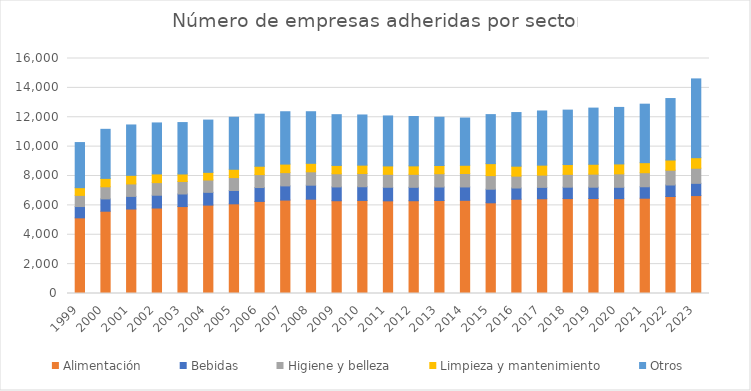
| Category | Alimentación | Bebidas | Higiene y belleza | Limpieza y mantenimiento | Otros |
|---|---|---|---|---|---|
| 1999.0 | 5150.832 | 769.747 | 760.498 | 524.127 | 3071.795 |
| 2000.0 | 5602.414 | 837.232 | 827.172 | 570.078 | 3341.104 |
| 2001.0 | 5751.27 | 859.478 | 849.15 | 585.225 | 3429.878 |
| 2002.0 | 5820.436 | 869.814 | 859.362 | 592.263 | 3471.126 |
| 2003.0 | 5919.087 | 855.393 | 850 | 513 | 3500.71 |
| 2004.0 | 6017.755 | 869.652 | 840.072 | 520.608 | 3559.066 |
| 2005.0 | 6105.6 | 908.4 | 879.6 | 564 | 3542.4 |
| 2006.0 | 6269 | 945 | 881 | 570 | 3543 |
| 2007.0 | 6360.75 | 965.25 | 903.375 | 581.625 | 3564 |
| 2008.0 | 6420.669 | 954.19 | 910.874 | 577.959 | 3512.309 |
| 2009.0 | 6316.39 | 938.692 | 896.08 | 568.572 | 3455.265 |
| 2010.0 | 6336.402 | 931.073 | 899.47 | 572.5 | 3415.555 |
| 2011.0 | 6309 | 923.523 | 882.424 | 571.762 | 3401.563 |
| 2012.0 | 6317 | 913.466 | 883.338 | 577.243 | 3359.819 |
| 2013.0 | 6333.6 | 915.6 | 906 | 559.2 | 3285.6 |
| 2014.0 | 6345.052 | 909.167 | 916.335 | 559.12 | 3217.327 |
| 2015.0 | 6175.26 | 925.68 | 925.68 | 816.06 | 3337.32 |
| 2016.0 | 6418.72 | 763.84 | 808.192 | 677.6 | 3651.648 |
| 2017.0 | 6450 | 776 | 836 | 677 | 3688 |
| 2018.0 | 6463 | 775 | 875 | 667 | 3706 |
| 2019.0 | 6466 | 771 | 890 | 672 | 3824 |
| 2020.0 | 6459.32 | 772.167 | 914.675 | 676.152 | 3846.686 |
| 2021.0 | 6488 | 779 | 957 | 685 | 3981 |
| 2022.0 | 6603 | 784 | 1008 | 693 | 4186 |
| 2023.0 | 6668 | 832 | 1029 | 717 | 5365 |